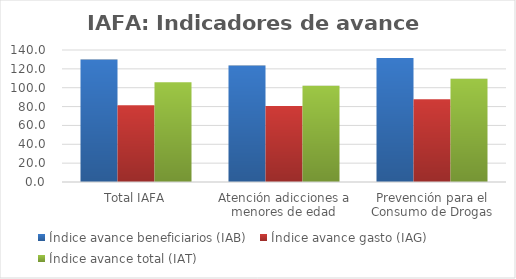
| Category | Índice avance beneficiarios (IAB)  | Índice avance gasto (IAG) | Índice avance total (IAT)  |
|---|---|---|---|
| Total IAFA | 129.915 | 81.493 | 105.704 |
| Atención adicciones a menores de edad | 123.513 | 80.527 | 102.02 |
| Prevención para el Consumo de Drogas | 131.393 | 87.747 | 109.57 |